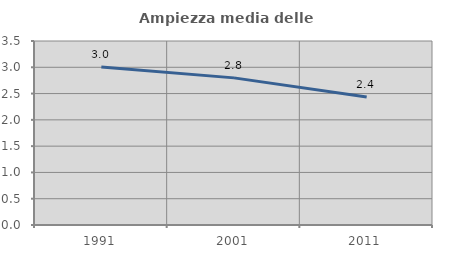
| Category | Ampiezza media delle famiglie |
|---|---|
| 1991.0 | 3.006 |
| 2001.0 | 2.799 |
| 2011.0 | 2.436 |